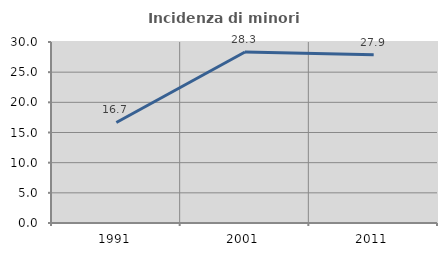
| Category | Incidenza di minori stranieri |
|---|---|
| 1991.0 | 16.667 |
| 2001.0 | 28.333 |
| 2011.0 | 27.907 |